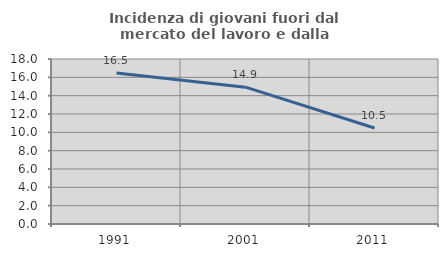
| Category | Incidenza di giovani fuori dal mercato del lavoro e dalla formazione  |
|---|---|
| 1991.0 | 16.477 |
| 2001.0 | 14.925 |
| 2011.0 | 10.476 |